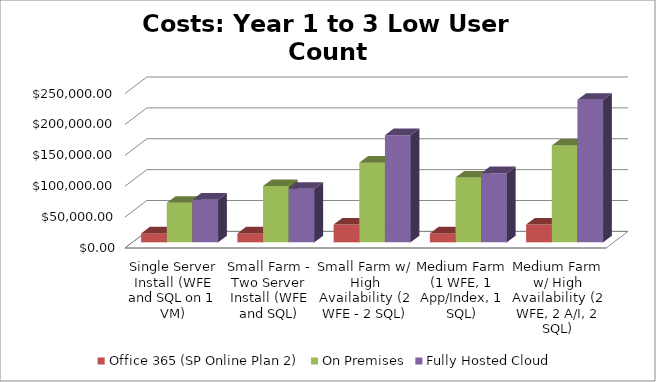
| Category | Office 365 (SP Online Plan 2) | On Premises | Fully Hosted Cloud |
|---|---|---|---|
| Single Server Install (WFE and SQL on 1 VM) | 14400 | 63941.62 | 69020 |
| Small Farm - Two Server Install (WFE and SQL) | 14400 | 91054.256 | 86660 |
| Small Farm w/ High Availability (2 WFE - 2 SQL) | 28800 | 128956.541 | 173500 |
| Medium Farm (1 WFE, 1 App/Index, 1 SQL) | 14400 | 104879.517 | 111860 |
| Medium Farm w/ High Availability (2 WFE, 2 A/I, 2 SQL) | 28800 | 156696.197 | 230740 |